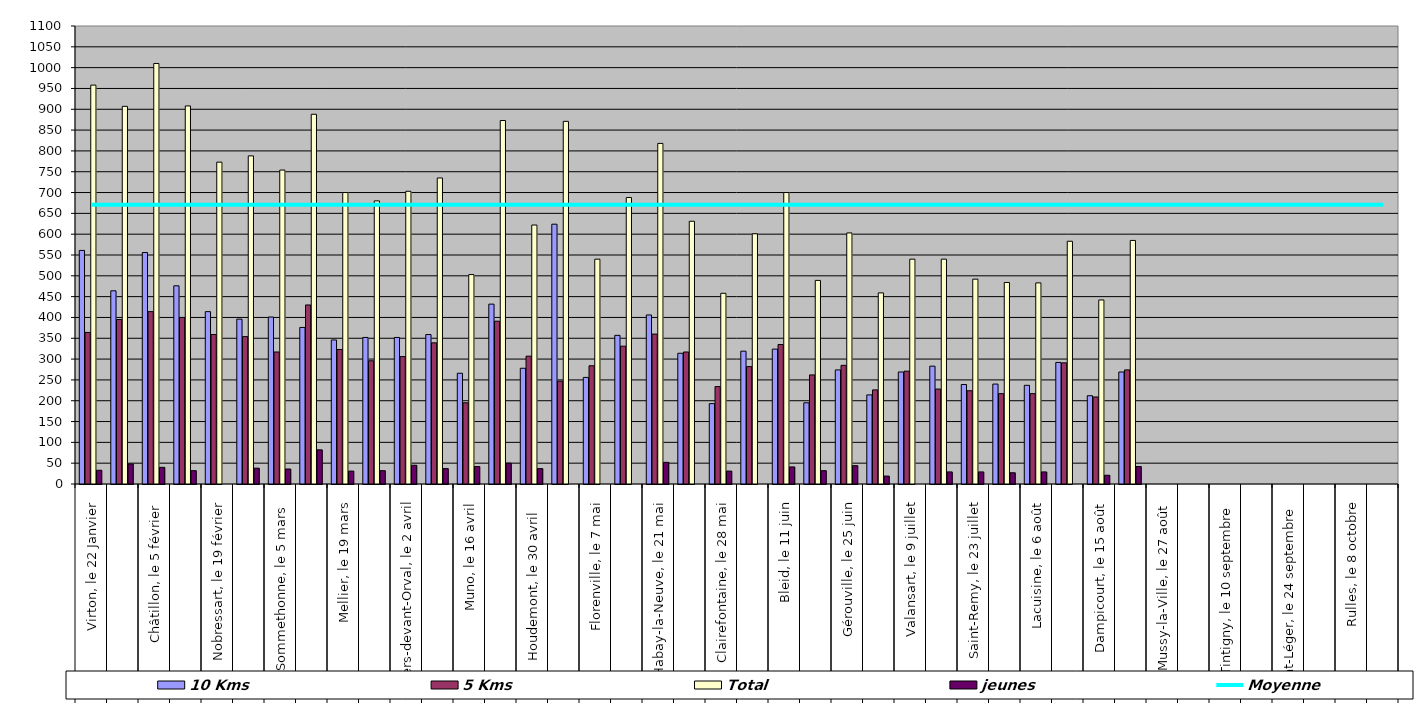
| Category | 10 Kms | 5 Kms | Total | jeunes |
|---|---|---|---|---|
| 0 | 561 | 364 | 958 | 33 |
| 1 | 464 | 395 | 907 | 48 |
| 2 | 556 | 414 | 1010 | 40 |
| 3 | 476 | 400 | 908 | 32 |
| 4 | 414 | 359 | 773 | 0 |
| 5 | 396 | 354 | 788 | 38 |
| 6 | 401 | 317 | 754 | 36 |
| 7 | 376 | 430 | 888 | 82 |
| 8 | 346 | 323 | 700 | 31 |
| 9 | 352 | 296 | 680 | 32 |
| 10 | 352 | 306 | 703 | 45 |
| 11 | 359 | 339 | 735 | 37 |
| 12 | 266 | 195 | 503 | 42 |
| 13 | 432 | 391 | 873 | 50 |
| 14 | 278 | 307 | 622 | 37 |
| 15 | 624 | 247 | 871 | 0 |
| 16 | 256 | 284 | 540 | 0 |
| 17 | 357 | 331 | 688 | 0 |
| 18 | 406 | 360 | 818 | 52 |
| 19 | 314 | 317 | 631 | 0 |
| 20 | 193 | 234 | 458 | 31 |
| 21 | 319 | 282 | 601 | 0 |
| 22 | 324 | 335 | 700 | 41 |
| 23 | 195 | 262 | 489 | 32 |
| 24 | 274 | 285 | 603 | 44 |
| 25 | 214 | 226 | 459 | 19 |
| 26 | 269 | 271 | 540 | 0 |
| 27 | 283 | 228 | 540 | 29 |
| 28 | 239 | 224 | 492 | 29 |
| 29 | 240 | 217 | 484 | 27 |
| 30 | 237 | 217 | 483 | 29 |
| 31 | 292 | 291 | 583 | 0 |
| 32 | 212 | 209 | 442 | 21 |
| 33 | 269 | 274 | 585 | 42 |
| 34 | 0 | 0 | 0 | 0 |
| 35 | 0 | 0 | 0 | 0 |
| 36 | 0 | 0 | 0 | 0 |
| 37 | 0 | 0 | 0 | 0 |
| 38 | 0 | 0 | 0 | 0 |
| 39 | 0 | 0 | 0 | 0 |
| 40 | 0 | 0 | 0 | 0 |
| 41 | 0 | 0 | 0 | 0 |